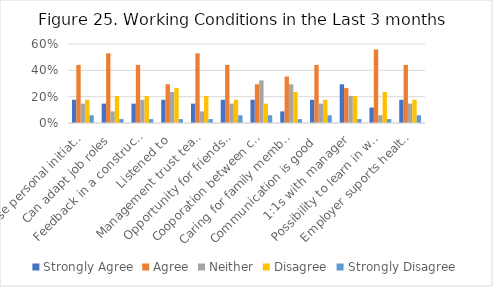
| Category | Strongly Agree | Agree | Neither | Disagree | Strongly Disagree |
|---|---|---|---|---|---|
| Can use personal initiative | 0.176 | 0.441 | 0.147 | 0.176 | 0.059 |
| Can adapt job roles | 0.147 | 0.529 | 0.088 | 0.206 | 0.029 |
| Feedback in a constructive way | 0.147 | 0.441 | 0.176 | 0.206 | 0.029 |
| Listened to | 0.176 | 0.294 | 0.235 | 0.265 | 0.029 |
| Management trust team  | 0.147 | 0.529 | 0.088 | 0.206 | 0.029 |
| Opportunity for friendships  | 0.176 | 0.441 | 0.147 | 0.176 | 0.059 |
| Cooporation between colleagues  | 0.176 | 0.294 | 0.324 | 0.147 | 0.059 |
| Caring for family member is supported | 0.088 | 0.353 | 0.294 | 0.235 | 0.029 |
| Communication is good  | 0.176 | 0.441 | 0.147 | 0.176 | 0.059 |
| 1:1s with manager | 0.294 | 0.265 | 0.206 | 0.206 | 0.029 |
| Possibility to learn in work  | 0.118 | 0.559 | 0.059 | 0.235 | 0.029 |
| Employer suports health and wellbeing | 0.176 | 0.441 | 0.147 | 0.176 | 0.059 |